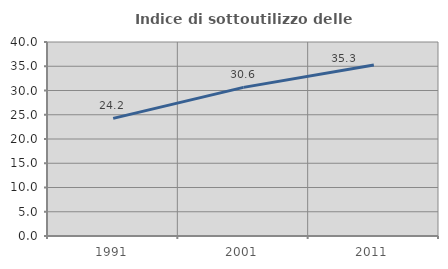
| Category | Indice di sottoutilizzo delle abitazioni  |
|---|---|
| 1991.0 | 24.246 |
| 2001.0 | 30.646 |
| 2011.0 | 35.256 |